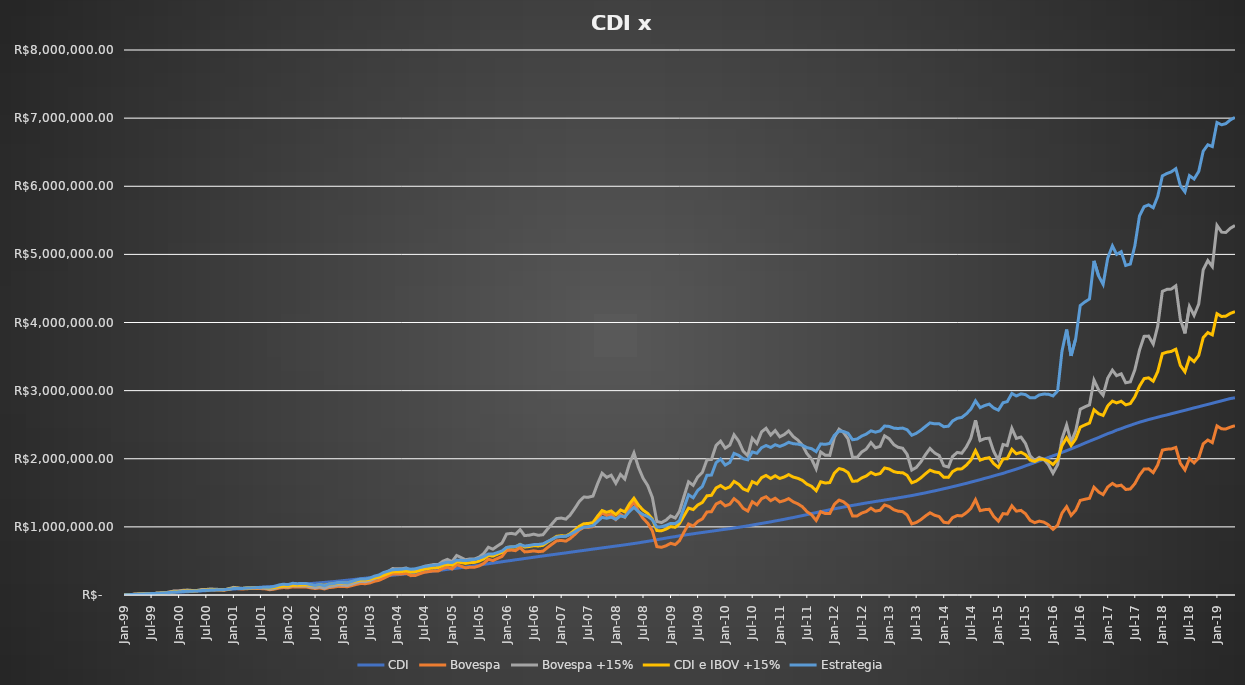
| Category | CDI | Bovespa | Bovespa +15% | CDI e IBOV +15% | Estrategia |
|---|---|---|---|---|---|
| 1999-01-01 | 1000 | 1000 | 1000 | 1000 | 1000 |
| 1999-01-01 | 1021.7 | 1204.5 | 1235.175 | 1128.438 | 1128.438 |
| 1999-02-01 | 4116.21 | 4585.428 | 4676.438 | 4396.324 | 4335.806 |
| 1999-03-01 | 7349.622 | 9104.789 | 9444.667 | 8397.144 | 8022.888 |
| 1999-04-01 | 10585.593 | 12845.602 | 13320.523 | 11953.058 | 11442.199 |
| 1999-05-01 | 13851.871 | 15481.153 | 15945.151 | 14898.511 | 14532.324 |
| 1999-06-01 | 17128.241 | 19375.641 | 19999.638 | 18563.94 | 18023.024 |
| 1999-07-01 | 20454.319 | 20095.563 | 20655.975 | 20555.147 | 20629.838 |
| 1999-08-01 | 23817.861 | 23368.091 | 23976.986 | 23897.423 | 23983.884 |
| 1999-09-01 | 27212.083 | 27718.137 | 28565.391 | 27888.737 | 27697.133 |
| 1999-10-01 | 30629.01 | 32361.557 | 33507.452 | 32068.231 | 31518.672 |
| 1999-11-01 | 34089.728 | 41645.306 | 43967.932 | 39028.83 | 36822.004 |
| 1999-12-01 | 37675.745 | 55378.038 | 59952.687 | 48814.216 | 43660.615 |
| 2000-01-01 | 41261.476 | 55972.862 | 60359.036 | 50810.256 | 46416.982 |
| 2000-02-01 | 44898.841 | 63549.157 | 69013.196 | 56956.019 | 51366.307 |
| 2000-03-01 | 48588.584 | 67154.754 | 72766.814 | 60677.699 | 55075.345 |
| 2000-04-01 | 52248.918 | 61167.93 | 66061.086 | 59155.002 | 56041.507 |
| 2000-05-01 | 56072.127 | 61768.049 | 66478.201 | 61275.164 | 58983.196 |
| 2000-06-01 | 59893.23 | 72436.586 | 78938.353 | 69415.791 | 65047.246 |
| 2000-07-01 | 63710.842 | 74206.97 | 80602.758 | 72156.8 | 68310.184 |
| 2000-08-01 | 67644.794 | 81391.588 | 88813.717 | 78229.256 | 73353.508 |
| 2000-09-01 | 71506.66 | 77488.356 | 84303.355 | 77905.008 | 75055.389 |
| 2000-10-01 | 75460.345 | 75127.831 | 81488.952 | 78474.649 | 77265.677 |
| 2000-11-01 | 79409.716 | 69822.843 | 75507.776 | 77458.746 | 78658.284 |
| 2000-12-01 | 83390.391 | 83629.753 | 91905.913 | 87648.152 | 85839.144 |
| 2001-01-01 | 87478.91 | 100334.58 | 112172.146 | 99825.528 | 94092.433 |
| 2001-02-01 | 91392.747 | 92918.454 | 103562.794 | 97477.77 | 94789.884 |
| 2001-03-01 | 95572.656 | 87151.507 | 96822.955 | 96197.805 | 96168.44 |
| 2001-04-01 | 99735.814 | 93144.537 | 103634.195 | 101685.004 | 101014.458 |
| 2001-05-01 | 104102.2 | 94423.55 | 104725.443 | 104413.821 | 104544.618 |
| 2001-06-01 | 108462.398 | 96819.524 | 107057.545 | 107759.972 | 108388.65 |
| 2001-07-01 | 113134.334 | 94299.505 | 103971.363 | 108552.848 | 111077.97 |
| 2001-08-01 | 117992.483 | 90838.817 | 99868.464 | 108930.474 | 113647.288 |
| 2001-09-01 | 122589.584 | 77726.692 | 85205.949 | 103897.767 | 113322.334 |
| 2001-10-01 | 127523.664 | 86256.471 | 95154.373 | 111339.018 | 125124.866 |
| 2001-11-01 | 132337.943 | 101564.938 | 113720.184 | 123029.063 | 147281.71 |
| 2001-12-01 | 137219.14 | 109782.729 | 123418.172 | 130318.656 | 158453.742 |
| 2002-01-01 | 142364.493 | 105666.139 | 118441.185 | 130402.839 | 152268.447 |
| 2002-02-01 | 147181.549 | 119869.617 | 135839.859 | 141510.704 | 172062.289 |
| 2002-03-01 | 152239.036 | 116050.354 | 131134.247 | 141686.642 | 166569.249 |
| 2002-04-01 | 157536.574 | 117526.509 | 132417.329 | 144976.951 | 167955.297 |
| 2002-05-01 | 162784.086 | 118465.506 | 133101.692 | 147942.889 | 168738.328 |
| 2002-06-01 | 167955.858 | 105201.275 | 117877.676 | 142916.767 | 152458.833 |
| 2002-07-01 | 173588.578 | 94827.597 | 105937.195 | 139762.886 | 140116.926 |
| 2002-08-01 | 179149.112 | 104039.649 | 116892.334 | 148020.723 | 151780.629 |
| 2002-09-01 | 184662.77 | 88896.429 | 99570.583 | 142116.676 | 134637.072 |
| 2002-10-01 | 190740.439 | 108364.269 | 123708.329 | 157224.384 | 159183.756 |
| 2002-11-01 | 196704.668 | 115094.972 | 131589.767 | 164147.218 | 167531.175 |
| 2002-12-01 | 203159.559 | 126633.238 | 145780.233 | 174469.896 | 181969.174 |
| 2003-01-01 | 210220.902 | 125860.911 | 144450.729 | 177335.815 | 181762.826 |
| 2003-02-01 | 217122.845 | 121077.712 | 138544.705 | 177833.775 | 177359.023 |
| 2003-03-01 | 224019.019 | 136063.619 | 157268.906 | 190643.962 | 195646.481 |
| 2003-04-01 | 231264.275 | 154889.059 | 181243.298 | 206253.786 | 218586.474 |
| 2003-05-01 | 238855.854 | 168767.615 | 198841.815 | 218848.835 | 235729.356 |
| 2003-06-01 | 246330.188 | 166013.4 | 195080.114 | 220705.151 | 233884.644 |
| 2003-07-01 | 254516.256 | 176821.819 | 208604.111 | 231560.183 | 247401.176 |
| 2003-08-01 | 262048.542 | 201058.776 | 240343.123 | 251195.832 | 276420.194 |
| 2003-09-01 | 269474.852 | 215302.414 | 258762.56 | 264118.706 | 293811.434 |
| 2003-10-01 | 276916.192 | 245197.272 | 298849.08 | 287882.636 | 329528.182 |
| 2003-11-01 | 283667.069 | 278576.618 | 344337.356 | 314002.213 | 350461.216 |
| 2003-12-01 | 290594.408 | 310212.96 | 387960.197 | 339277.302 | 370845.452 |
| 2004-01-01 | 297293.698 | 307794.376 | 384196.585 | 340745.142 | 374476.935 |
| 2004-02-01 | 303536.87 | 309426.881 | 385492.92 | 344514.895 | 379504.569 |
| 2004-03-01 | 310736.425 | 317988.079 | 396445.37 | 353590.898 | 388658.609 |
| 2004-04-01 | 317407.141 | 284234.944 | 353708.875 | 335558.008 | 378764.848 |
| 2004-05-01 | 324316.108 | 286315.792 | 355567.407 | 339941.758 | 384522.42 |
| 2004-06-01 | 331309.365 | 313068.619 | 392421.549 | 361865.457 | 402422.588 |
| 2004-07-01 | 338588.525 | 333831.675 | 420977.643 | 379783.084 | 417669.226 |
| 2004-08-01 | 345995.016 | 343871.457 | 434167.946 | 390081.481 | 427718.352 |
| 2004-09-01 | 353322.555 | 353600.763 | 446921.163 | 400121.859 | 437545.397 |
| 2004-10-01 | 360634.058 | 353640.977 | 446186.817 | 403410.437 | 442733.192 |
| 2004-11-01 | 368179.483 | 388774.329 | 495729.309 | 431954.396 | 465293.772 |
| 2004-12-01 | 376672.94 | 408424.738 | 523104.704 | 449888.822 | 481023.689 |
| 2005-01-01 | 384912.426 | 382460.437 | 489066.933 | 436989.68 | 475609.833 |
| 2005-02-01 | 392644.958 | 445399.534 | 580060.803 | 486352.88 | 512339.678 |
| 2005-03-01 | 401658.761 | 424051.44 | 551400.601 | 476529.681 | 509407.004 |
| 2005-04-01 | 410364.45 | 398695.224 | 517588.401 | 463976.425 | 504492.757 |
| 2005-05-01 | 419564.916 | 407559.974 | 529329.08 | 474446.998 | 515420.774 |
| 2005-06-01 | 429241.442 | 408014.503 | 529028.64 | 479135.041 | 522650.997 |
| 2005-07-01 | 438768.288 | 427290.677 | 556257.224 | 497512.756 | 539057.52 |
| 2005-08-01 | 449057.465 | 463380.03 | 608715.137 | 528886.301 | 564568.66 |
| 2005-09-01 | 458838.327 | 525237.19 | 700493.355 | 579665.841 | 602893.214 |
| 2005-10-01 | 468304.063 | 504994.753 | 672539.647 | 570421.855 | 600648.039 |
| 2005-11-01 | 477808.059 | 537001.254 | 719898.958 | 598853.509 | 623752.776 |
| 2005-12-01 | 487875.938 | 566029.314 | 762969.247 | 625422.593 | 645850.288 |
| 2006-01-01 | 497895.464 | 652847.332 | 895720.608 | 696808.036 | 697969.481 |
| 2006-02-01 | 506605.672 | 659716.831 | 904818.427 | 705712.05 | 707570.758 |
| 2006-03-01 | 516842.073 | 651384.374 | 892294.732 | 704568.402 | 711147.661 |
| 2006-04-01 | 525456.367 | 695937.781 | 960673.63 | 743064.998 | 740496.15 |
| 2006-05-01 | 535220.608 | 632538.692 | 872124.635 | 703672.622 | 718289.548 |
| 2006-06-01 | 544571.612 | 637318.2 | 877942.537 | 711257.074 | 727293.185 |
| 2006-07-01 | 553978.199 | 648130.082 | 893302.16 | 723640.18 | 739522.518 |
| 2006-08-01 | 563940.427 | 636284.317 | 875866.471 | 719903.449 | 741255.568 |
| 2006-09-01 | 572893.301 | 643120.022 | 884930.65 | 728911.976 | 751016.313 |
| 2006-10-01 | 582170.538 | 696000.488 | 966761.133 | 774465.836 | 785251.023 |
| 2006-11-01 | 591139.278 | 746532.521 | 1045596.453 | 818367.866 | 818222.403 |
| 2006-12-01 | 599961.843 | 794954.192 | 1121673.14 | 860817.491 | 850141.379 |
| 2007-01-01 | 609473.831 | 800986.418 | 1129587.962 | 869530.896 | 859953.54 |
| 2007-02-01 | 617802.353 | 790479.446 | 1113560.484 | 865681.419 | 860875.599 |
| 2007-03-01 | 627320.778 | 828075.15 | 1172544.827 | 899932.802 | 887626.653 |
| 2007-04-01 | 636245.793 | 888253.121 | 1268553.933 | 952399.863 | 926165.711 |
| 2007-05-01 | 645766.1 | 951590.957 | 1370550.765 | 1008158.433 | 967142.263 |
| 2007-06-01 | 654604.995 | 993347.35 | 1437681.85 | 1046143.423 | 996014.455 |
| 2007-07-01 | 663983.763 | 992461.595 | 1435063.191 | 1049523.477 | 1002220.813 |
| 2007-08-01 | 673586.903 | 1003823.472 | 1451954.881 | 1062770.892 | 1015058.341 |
| 2007-09-01 | 681999.598 | 1114251.537 | 1633485.12 | 1157742.359 | 1081376.625 |
| 2007-10-01 | 691301.594 | 1206966.835 | 1787606.338 | 1239453.966 | 1139315.884 |
| 2007-11-01 | 700133.728 | 1167134.009 | 1727218.874 | 1213676.301 | 1126005.116 |
| 2007-12-01 | 709040.051 | 1186515.885 | 1758075.398 | 1233557.724 | 1142887.602 |
| 2008-01-01 | 718602.212 | 1107677.193 | 1639913.411 | 1179257.811 | 1111103.182 |
| 2008-02-01 | 727337.506 | 1185314.7 | 1769877.759 | 1248607.633 | 1160535.156 |
| 2008-03-01 | 736459.926 | 1141138.606 | 1702494.512 | 1219477.219 | 1145178.674 |
| 2008-04-01 | 746100.276 | 1273655.096 | 1927515.787 | 1336808.032 | 1226623.457 |
| 2008-05-01 | 755624.939 | 1365510.291 | 2085034.271 | 1420329.605 | 1285706.149 |
| 2008-06-01 | 765818.221 | 1225774.668 | 1870252.297 | 1318035.259 | 1222671.148 |
| 2008-07-01 | 776998.447 | 1124574.576 | 1714400.502 | 1245699.474 | 1179847.274 |
| 2008-08-01 | 787898.271 | 1055071.531 | 1606971.65 | 1197434.96 | 1152758.767 |
| 2008-09-01 | 799584.707 | 941366.241 | 1432391.777 | 1115988.242 | 1104217.501 |
| 2008-10-01 | 812006.249 | 710163.413 | 1079414.616 | 945710.432 | 997628.526 |
| 2008-11-01 | 823123.711 | 700540.421 | 1063255.877 | 943189.794 | 1000757.108 |
| 2008-12-01 | 835301.945 | 721902.826 | 1098259.547 | 966780.746 | 1021527.852 |
| 2009-01-01 | 847042.92 | 758683.297 | 1160276.047 | 1003659.483 | 1050808.764 |
| 2009-02-01 | 857291.236 | 740051.492 | 1130239.007 | 993765.121 | 1048707.152 |
| 2009-03-01 | 868605.951 | 796402.589 | 1226810.552 | 1047708.251 | 1088949.535 |
| 2009-04-01 | 878889.09 | 923709.691 | 1449731.424 | 1164310.257 | 1285329.454 |
| 2009-05-01 | 888647.888 | 1042455.732 | 1661394.502 | 1275021.195 | 1471554.248 |
| 2009-06-01 | 898347.73 | 1011373.875 | 1610135.241 | 1254241.485 | 1427116.396 |
| 2009-07-01 | 908414.296 | 1079395.24 | 1732047.505 | 1320230.901 | 1534342.523 |
| 2009-08-01 | 917715.815 | 1116490.691 | 1797899.601 | 1357807.708 | 1592430.967 |
| 2009-09-01 | 927082.565 | 1219125.362 | 1985221.675 | 1456152.12 | 1756535.659 |
| 2009-10-01 | 936511.295 | 1222614.212 | 1989136.257 | 1462823.776 | 1760508.485 |
| 2009-11-01 | 945702.675 | 1335061.561 | 2196718.69 | 1571210.682 | 1941944.43 |
| 2009-12-01 | 955569.385 | 1368836.977 | 2257901.25 | 1606735.317 | 1995808.207 |
| 2010-01-01 | 964878.688 | 1308046.558 | 2155769.341 | 1560324.015 | 1907597.185 |
| 2010-02-01 | 973613.37 | 1333072.14 | 2200476.765 | 1587045.067 | 1947039.448 |
| 2010-03-01 | 984005.356 | 1413831.538 | 2350955.465 | 1667480.411 | 2078324.731 |
| 2010-04-01 | 993558.085 | 1359591.544 | 2258855.664 | 1626206.874 | 2050303.599 |
| 2010-05-01 | 1004032.27 | 1272115.466 | 2111668.448 | 1557850.359 | 2001050.089 |
| 2010-06-01 | 1014995.882 | 1232399.098 | 2043827.055 | 1529411.468 | 1984476.327 |
| 2010-07-01 | 1026742.502 | 1368822.2 | 2301042.975 | 1663892.739 | 2100221.403 |
| 2010-08-01 | 1038869.11 | 1323671.241 | 2223171.067 | 1631020.088 | 2080930.272 |
| 2010-09-01 | 1050667.695 | 1413966.209 | 2394625.432 | 1722646.563 | 2161972.756 |
| 2010-10-01 | 1062156.042 | 1442329.904 | 2446980.551 | 1754568.296 | 2194540.746 |
| 2010-11-01 | 1073736.939 | 1384626.048 | 2347081.368 | 1710409.153 | 2165759.449 |
| 2010-12-01 | 1086719.367 | 1420374.023 | 2413862.576 | 1750290.971 | 2205802.539 |
| 2011-01-01 | 1099097.492 | 1367293.086 | 2321638.191 | 1710367.841 | 2181039.749 |
| 2011-02-01 | 1111381.561 | 1386873.632 | 2356985.531 | 1734183.546 | 2207581.259 |
| 2011-03-01 | 1124620.499 | 1414752.37 | 2408565.833 | 1766593.166 | 2241724.199 |
| 2011-04-01 | 1137078.979 | 1366996.836 | 2325231.776 | 1731155.378 | 2220657.409 |
| 2011-05-01 | 1151311.038 | 1338623.908 | 2274915.269 | 1713113.153 | 2214884.514 |
| 2011-06-01 | 1165307.004 | 1295606.208 | 2199782.775 | 1682544.89 | 2198865.432 |
| 2011-07-01 | 1179598.692 | 1224066.212 | 2076343.044 | 1627970.868 | 2163768.719 |
| 2011-08-01 | 1195279.697 | 1178474.39 | 1997001.059 | 1596140.378 | 2147967.905 |
| 2011-09-01 | 1209539.932 | 1094281.58 | 1852400.981 | 1530970.456 | 2104375.245 |
| 2011-10-01 | 1223218.771 | 1223359.233 | 2100564.39 | 1661891.58 | 2217748.6 |
| 2011-11-01 | 1236747.085 | 1195577.616 | 2050764.924 | 1643756.004 | 2211398.848 |
| 2011-12-01 | 1250961.837 | 1196060.603 | 2049452.017 | 1650206.927 | 2225255.316 |
| 2012-01-01 | 1265063.162 | 1332516.049 | 2315155.613 | 1790109.387 | 2345938.842 |
| 2012-02-01 | 1277465.85 | 1393477.445 | 2433854.76 | 1855660.305 | 2405798.838 |
| 2012-03-01 | 1290815.855 | 1368827.192 | 2388605.036 | 1839710.445 | 2401076.383 |
| 2012-04-01 | 1302871.273 | 1314621.998 | 2291875.106 | 1797373.189 | 2374312.869 |
| 2012-05-01 | 1315435.474 | 1161352.029 | 2022702.918 | 1669069.196 | 2279183.742 |
| 2012-06-01 | 1326853.684 | 1161441.149 | 2020638.661 | 1673746.173 | 2289563.33 |
| 2012-07-01 | 1338835.516 | 1201819.71 | 2098341.282 | 1718588.399 | 2332423.36 |
| 2012-08-01 | 1351047.217 | 1225542.609 | 2142905.812 | 1746976.515 | 2362288.917 |
| 2012-09-01 | 1361319.804 | 1274121.539 | 2237460.884 | 1799390.344 | 2409921.159 |
| 2012-10-01 | 1372603.954 | 1231656.013 | 2160700.476 | 1766652.215 | 2390342.645 |
| 2012-11-01 | 1383092.742 | 1243422.07 | 2181367.091 | 1782229.917 | 2408718.443 |
| 2012-12-01 | 1393497.25 | 1321830.606 | 2336344.431 | 1864920.84 | 2480493.299 |
| 2013-01-01 | 1404689.103 | 1298996.409 | 2293727.215 | 1849208.159 | 2474434.922 |
| 2013-02-01 | 1414467.126 | 1251088.349 | 2206925.181 | 1810696.153 | 2449224.887 |
| 2013-03-01 | 1425088.846 | 1230636.897 | 2168599.58 | 1796844.213 | 2444246.211 |
| 2013-04-01 | 1436668.804 | 1224014.529 | 2154661.103 | 1795664.954 | 2450028.304 |
| 2013-05-01 | 1448087.987 | 1174252.905 | 2064881.676 | 1756484.831 | 2425493.617 |
| 2013-06-01 | 1459676.977 | 1044105.601 | 1834004.258 | 1646840.618 | 2345125.045 |
| 2013-07-01 | 1473042.969 | 1064278.133 | 1871650.158 | 1672346.564 | 2373349.963 |
| 2013-08-01 | 1486311.8 | 1106553.968 | 1953985.353 | 1720148.576 | 2419178.375 |
| 2013-09-01 | 1499723.579 | 1161148.228 | 2061635.145 | 1780679.362 | 2475175.3 |
| 2013-10-01 | 1514794.957 | 1206756.053 | 2151535.638 | 1833165.298 | 2525943.248 |
| 2013-11-01 | 1528578.89 | 1170197.03 | 2084082.323 | 1806330.607 | 2512947.968 |
| 2013-12-01 | 1543529.8 | 1151375.565 | 2048262.592 | 1795896.196 | 2513768.55 |
| 2014-01-01 | 1559516.011 | 1067681.96 | 1897212.771 | 1728364.391 | 2470145.823 |
| 2014-02-01 | 1574744.261 | 1058476.186 | 1878550.345 | 1726647.303 | 2478056.426 |
| 2014-03-01 | 1589733.54 | 1136310.257 | 2034097.04 | 1811915.29 | 2554537.318 |
| 2014-04-01 | 1605720.689 | 1166653.703 | 2093320.918 | 1849520.804 | 2594035.763 |
| 2014-05-01 | 1622526.73 | 1160881.3 | 2080598.511 | 1851562.621 | 2606016.423 |
| 2014-06-01 | 1638813.786 | 1207643.237 | 2173693.311 | 1906253.548 | 2659166.677 |
| 2014-07-01 | 1657253.403 | 1271296.463 | 2302103.496 | 1979678.449 | 2728580.729 |
| 2014-08-01 | 1674523.281 | 1398922.658 | 2564358.486 | 2119440.883 | 2849428.142 |
| 2014-09-01 | 1692629.378 | 1237897.707 | 2266977.543 | 1979803.46 | 2750670.443 |
| 2014-10-01 | 1711649.684 | 1252686.235 | 2294777.048 | 2003213.366 | 2781007.313 |
| 2014-11-01 | 1729015.019 | 1257820.901 | 2302269.202 | 2015642.11 | 2801523.1 |
| 2014-12-01 | 1748569.619 | 1152138.14 | 2106554.997 | 1927562.308 | 2744489.072 |
| 2015-01-01 | 1767846.955 | 1083519.575 | 1978762.587 | 1873304.771 | 2713887.937 |
| 2015-02-01 | 1785341.337 | 1194845.577 | 2208981.576 | 1997161.457 | 2822041.144 |
| 2015-03-01 | 1806870.342 | 1187783.674 | 2193400.931 | 2000135.637 | 2838011.685 |
| 2015-04-01 | 1827031.533 | 1309028.493 | 2447218.935 | 2137125.234 | 2958240.009 |
| 2015-05-01 | 1848035.383 | 1231076.335 | 2299040.427 | 2073537.905 | 2921590.619 |
| 2015-06-01 | 1870763.718 | 1241604.2 | 2318189.241 | 2094476.479 | 2952471.631 |
| 2015-07-01 | 1895823.538 | 1192704.205 | 2224395.649 | 2060109.594 | 2941606.675 |
| 2015-08-01 | 1919851.11 | 1096102.045 | 2041853.592 | 1980852.351 | 2894846.534 |
| 2015-09-01 | 1944144.763 | 1062172.216 | 1976146.511 | 1960145.637 | 2894160.698 |
| 2015-10-01 | 1968713.286 | 1084345.316 | 2020114.844 | 1994414.065 | 2936707.281 |
| 2015-11-01 | 1992516.833 | 1069621.587 | 1990138.072 | 1991327.452 | 2949472.516 |
| 2015-12-01 | 2018690.77 | 1030574.821 | 1915007.059 | 1966848.915 | 2947160.309 |
| 2016-01-01 | 2043017.586 | 963395.091 | 1787774.38 | 1915395.983 | 2922482.875 |
| 2016-02-01 | 2066506.406 | 1023509.041 | 1912484.361 | 1989495.383 | 2995308.003 |
| 2016-03-01 | 2093523.028 | 1200707.625 | 2289300.711 | 2191411.869 | 3578525.08 |
| 2016-04-01 | 2118628.766 | 1296393.112 | 2495283.939 | 2306956.353 | 3896379.401 |
| 2016-05-01 | 2145123.683 | 1168284.347 | 2246207.09 | 2195665.387 | 3509505.411 |
| 2016-06-01 | 2173052.659 | 1245075.261 | 2412162.143 | 2292607.401 | 3764886.296 |
| 2016-07-01 | 2200150.266 | 1388109.305 | 2726790.515 | 2463470.39 | 4249672.635 |
| 2016-08-01 | 2229885.494 | 1405437.731 | 2762124.883 | 2496005.189 | 4303057.093 |
| 2016-09-01 | 2257612.468 | 1419705.233 | 2790564.032 | 2524088.25 | 4345752.579 |
| 2016-10-01 | 2284290.123 | 1582475.03 | 3154338.859 | 2719314.491 | 4904998.466 |
| 2016-11-01 | 2311004.747 | 1511750.442 | 3010522.602 | 2660763.675 | 4682506.609 |
| 2016-12-01 | 2339960.938 | 1473700.705 | 2931856.14 | 2635908.539 | 4560474.156 |
| 2017-01-01 | 2368372.693 | 1585681.217 | 3183937.38 | 2776155.037 | 4946810.429 |
| 2017-02-01 | 2391856.61 | 1637612.598 | 3299818.702 | 2845837.656 | 5123622.068 |
| 2017-03-01 | 2420012.184 | 1599269.161 | 3219587.671 | 2819799.928 | 4999542.816 |
| 2017-04-01 | 2442037.676 | 1612523.683 | 3246305.916 | 2844171.796 | 5039392.042 |
| 2017-05-01 | 2467666.499 | 1548964.107 | 3115434.513 | 2791550.506 | 4837912.486 |
| 2017-06-01 | 2490631.955 | 1556620 | 3129193.112 | 2809912.534 | 4857926.689 |
| 2017-07-01 | 2513508.696 | 1634481.76 | 3305090.171 | 2909299.434 | 5125925.099 |
| 2017-08-01 | 2536675.996 | 1759637.899 | 3591891.227 | 3064283.612 | 5563241.808 |
| 2017-09-01 | 2555871.51 | 1848654.629 | 3796636.523 | 3176254.017 | 5699968.968 |
| 2017-10-01 | 2575327.613 | 1852024.959 | 3800510.439 | 3187919.026 | 5726707.308 |
| 2017-11-01 | 2592957.044 | 1796591.673 | 3683699.861 | 3138328.452 | 5684613.995 |
| 2017-12-01 | 2609912.909 | 1910446.52 | 3947865.679 | 3278889.294 | 5850596.166 |
| 2018-01-01 | 2628154.03 | 2126604.463 | 4457011.081 | 3542582.555 | 6152665.473 |
| 2018-02-01 | 2643386.265 | 2140678.406 | 4486681.947 | 3565034.106 | 6187537.341 |
| 2018-03-01 | 2660451.808 | 2143892.774 | 4490198.26 | 3575325.034 | 6210646.575 |
| 2018-04-01 | 2677235.171 | 2165785.43 | 4538669.427 | 3607952.299 | 6257973.403 |
| 2018-05-01 | 2694105.388 | 1933038.454 | 4047989.96 | 3371047.674 | 6010169.716 |
| 2018-06-01 | 2711062.908 | 1835364.454 | 3840338.482 | 3275700.695 | 5917508.573 |
| 2018-07-01 | 2728778.557 | 2001611.218 | 4235820.208 | 3482299.383 | 6155949.616 |
| 2018-08-01 | 2747265.01 | 1940263.198 | 4102754.079 | 3425009.545 | 6106303.781 |
| 2018-09-01 | 2763139.001 | 2010888.757 | 4270066.358 | 3516602.679 | 6217225.451 |
| 2018-10-01 | 2781159.135 | 2219104.021 | 4773805.639 | 3777482.387 | 6514976.096 |
| 2018-11-01 | 2797898.961 | 2274990.097 | 4907546.809 | 3852722.885 | 6608689.713 |
| 2018-12-01 | 2814721.397 | 2236758.476 | 4821665.912 | 3818193.654 | 6582542.635 |
| 2019-01-01 | 2833021.624 | 2482100.343 | 5424999.091 | 4129010.358 | 6934751.807 |
| 2019-02-01 | 2850017.391 | 2438877.477 | 5327038.308 | 4088527.85 | 6902266.39 |
| 2019-03-01 | 2866392.336 | 2437482.098 | 5320444.239 | 4093418.288 | 6918770.005 |
| 2019-04-01 | 2884313.177 | 2464398.822 | 5383439.456 | 4133876.316 | 6975388.641 |
| 2019-05-01 | 2894531.46 | 2484670.614 | 5424144.532 | 4159337.996 | 7009051.878 |